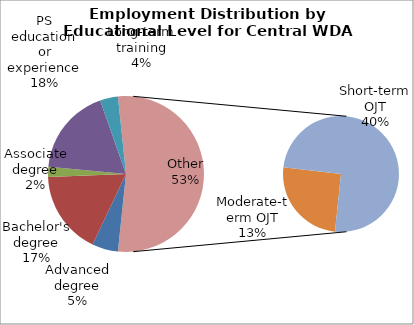
| Category | Series 0 |
|---|---|
| Advanced degree | 15630 |
| Bachelor's degree | 50090 |
| Associate degree | 6000 |
| PS education or experience | 52540 |
| Long-term training | 10700 |
| Moderate-term OJT | 38890 |
| Short-term OJT | 115250 |